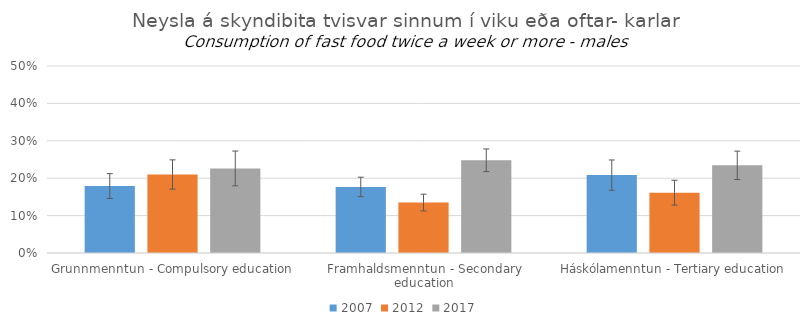
| Category | 2007 | 2012 | 2017 |
|---|---|---|---|
| Grunnmenntun - Compulsory education | 0.179 | 0.21 | 0.226 |
| Framhaldsmenntun - Secondary education | 0.177 | 0.135 | 0.248 |
| Háskólamenntun - Tertiary education | 0.208 | 0.161 | 0.234 |